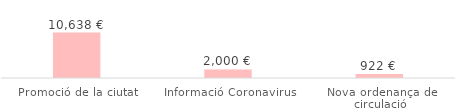
| Category | Total |
|---|---|
| Promoció de la ciutat | 10637.94 |
| Informació Coronavirus | 2000 |
| Nova ordenança de circulació | 922.02 |